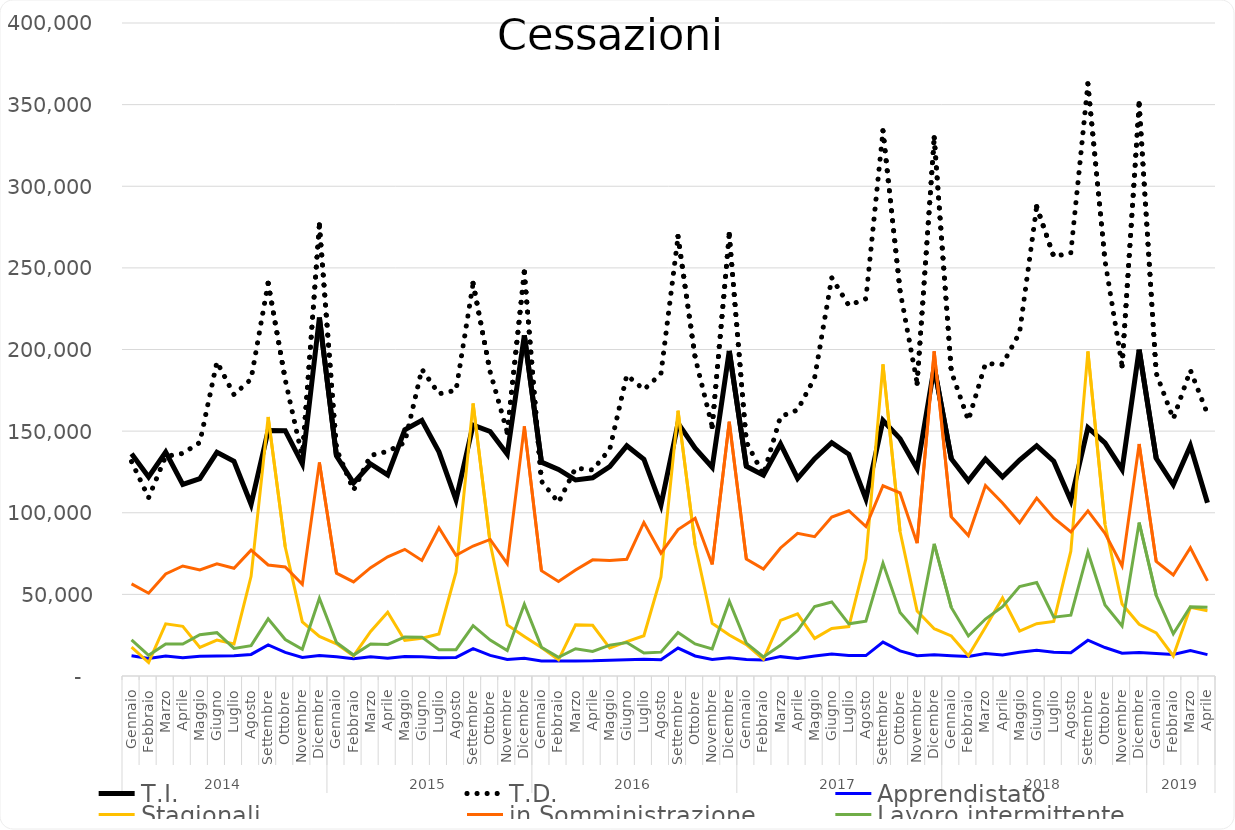
| Category | T.I. | T.D. | Apprendistato | Stagionali | in Somministrazione | Lavoro intermittente |
|---|---|---|---|---|---|---|
| 0 | 136150 | 131342 | 12417 | 17625 | 56394 | 22091 |
| 1 | 121982 | 109240 | 10766 | 8271 | 50700 | 12655 |
| 2 | 137177 | 134529 | 12288 | 31941 | 62552 | 19592 |
| 3 | 117316 | 136349 | 11118 | 30408 | 67376 | 19607 |
| 4 | 120941 | 143066 | 12092 | 17482 | 64946 | 25310 |
| 5 | 136995 | 192426 | 12268 | 22017 | 68720 | 26528 |
| 6 | 131572 | 172323 | 12337 | 19663 | 65995 | 16862 |
| 7 | 105193 | 181862 | 13223 | 61051 | 77075 | 18605 |
| 8 | 150436 | 240590 | 19086 | 158671 | 68004 | 35016 |
| 9 | 150292 | 181440 | 14495 | 79045 | 66820 | 22313 |
| 10 | 129926 | 133845 | 11383 | 33189 | 56121 | 16419 |
| 11 | 219564 | 276344 | 12627 | 24287 | 130844 | 47663 |
| 12 | 134760 | 139066 | 11769 | 19690 | 62987 | 20472 |
| 13 | 118245 | 113817 | 10611 | 12343 | 57652 | 12821 |
| 14 | 129887 | 135107 | 11768 | 27293 | 66344 | 19553 |
| 15 | 123205 | 137576 | 10944 | 39020 | 72982 | 19313 |
| 16 | 150818 | 143063 | 12003 | 21801 | 77593 | 23934 |
| 17 | 156557 | 187931 | 11841 | 23170 | 70789 | 23810 |
| 18 | 137335 | 172852 | 11248 | 25758 | 90771 | 16110 |
| 19 | 107985 | 175006 | 11384 | 63641 | 73927 | 16130 |
| 20 | 153717 | 240531 | 16799 | 166943 | 79619 | 30874 |
| 21 | 149774 | 186266 | 12640 | 81323 | 83637 | 21996 |
| 22 | 135838 | 149287 | 10118 | 31306 | 68827 | 15570 |
| 23 | 208699 | 247508 | 10868 | 24240 | 152934 | 44004 |
| 24 | 130993 | 119339 | 9240 | 17478 | 64533 | 17661 |
| 25 | 126502 | 106299 | 9249 | 9924 | 57929 | 11446 |
| 26 | 120053 | 127336 | 9179 | 31307 | 64877 | 16719 |
| 27 | 121388 | 126202 | 9296 | 31098 | 71155 | 15093 |
| 28 | 128274 | 138922 | 9676 | 17129 | 70755 | 18927 |
| 29 | 140997 | 184334 | 9992 | 21053 | 71515 | 20500 |
| 30 | 132788 | 175425 | 10197 | 24678 | 94054 | 14061 |
| 31 | 104742 | 185130 | 9989 | 60727 | 75262 | 14619 |
| 32 | 154878 | 269228 | 17110 | 162504 | 89698 | 26686 |
| 33 | 139594 | 195148 | 12285 | 80236 | 96625 | 19629 |
| 34 | 127852 | 152784 | 10073 | 32243 | 68345 | 16648 |
| 35 | 199217 | 270495 | 11228 | 25122 | 155713 | 45775 |
| 36 | 128463 | 143265 | 10136 | 19236 | 71660 | 20127 |
| 37 | 122984 | 123244 | 9736 | 10195 | 65503 | 11660 |
| 38 | 142125 | 158891 | 11862 | 34042 | 78439 | 18823 |
| 39 | 121034 | 162967 | 10753 | 38064 | 87441 | 27823 |
| 40 | 133148 | 182738 | 12310 | 23026 | 85351 | 42600 |
| 41 | 142944 | 243943 | 13506 | 29091 | 97315 | 45367 |
| 42 | 135823 | 227015 | 12530 | 30302 | 101225 | 31965 |
| 43 | 108507 | 231080 | 12508 | 71770 | 91572 | 33569 |
| 44 | 156511 | 333992 | 20798 | 190840 | 116534 | 69143 |
| 45 | 145393 | 236006 | 15365 | 88500 | 112110 | 38926 |
| 46 | 126989 | 179349 | 12424 | 39848 | 81344 | 26987 |
| 47 | 189144 | 329695 | 13013 | 28951 | 198908 | 80998 |
| 48 | 133048 | 186553 | 12469 | 24525 | 97495 | 42020 |
| 49 | 119514 | 156631 | 11949 | 12367 | 86043 | 24535 |
| 50 | 132926 | 191365 | 13713 | 29830 | 116679 | 34895 |
| 51 | 121926 | 190889 | 12916 | 47827 | 106017 | 42455 |
| 52 | 132274 | 210328 | 14509 | 27537 | 93848 | 54800 |
| 53 | 141073 | 287482 | 15750 | 32071 | 108965 | 57249 |
| 54 | 131530 | 256921 | 14579 | 33420 | 96834 | 36033 |
| 55 | 107503 | 259221 | 14237 | 76434 | 88317 | 37247 |
| 56 | 152125 | 362742 | 21949 | 198787 | 101173 | 75971 |
| 57 | 142823 | 254433 | 17429 | 92977 | 87403 | 43481 |
| 58 | 126532 | 190003 | 13924 | 44115 | 67363 | 30609 |
| 59 | 199870 | 350532 | 14387 | 31707 | 142133 | 93966 |
| 60 | 133335 | 185419 | 13780 | 26457 | 70106 | 49367 |
| 61 | 117090 | 157465 | 13217 | 12263 | 61875 | 25835 |
| 62 | 140998 | 187313 | 15523 | 42065 | 78566 | 42466 |
| 63 | 106175 | 160554 | 13094 | 40018 | 58262 | 42148 |